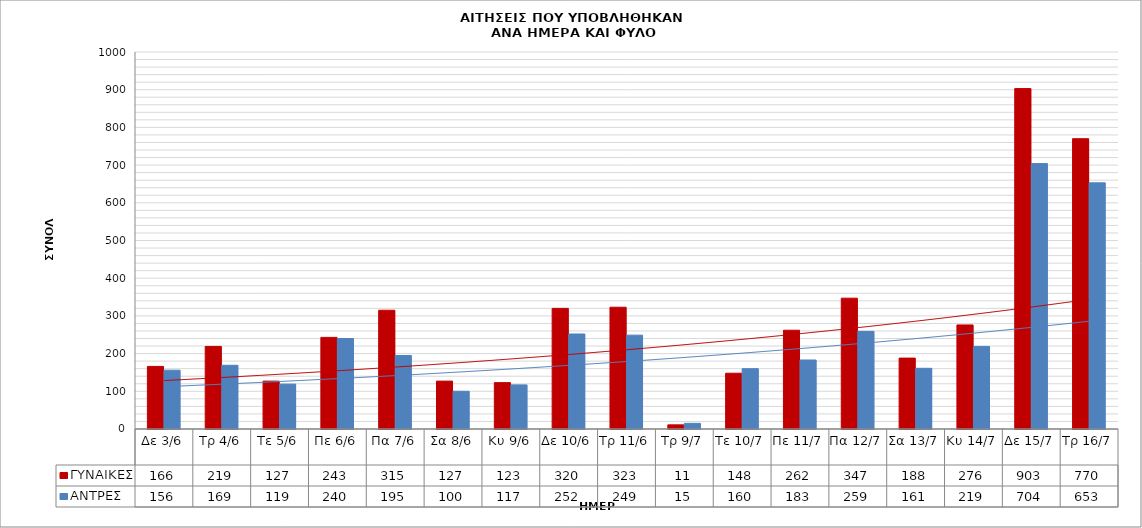
| Category | ΓΥΝΑΙΚΕΣ | ΑΝΤΡΕΣ |
|---|---|---|
| Δε 3/6 | 166 | 156 |
| Τρ 4/6 | 219 | 169 |
| Τε 5/6 | 127 | 119 |
| Πε 6/6 | 243 | 240 |
| Πα 7/6 | 315 | 195 |
| Σα 8/6 | 127 | 100 |
| Κυ 9/6 | 123 | 117 |
| Δε 10/6 | 320 | 252 |
| Τρ 11/6 | 323 | 249 |
| Τρ 9/7 | 11 | 15 |
| Τε 10/7 | 148 | 160 |
| Πε 11/7 | 262 | 183 |
| Πα 12/7 | 347 | 259 |
| Σα 13/7 | 188 | 161 |
| Κυ 14/7 | 276 | 219 |
| Δε 15/7 | 903 | 704 |
| Τρ 16/7 | 770 | 653 |